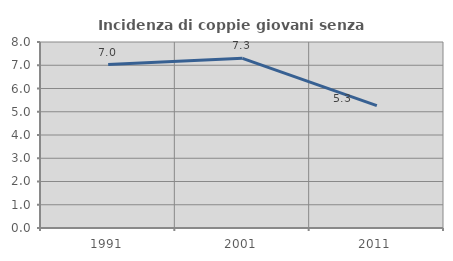
| Category | Incidenza di coppie giovani senza figli |
|---|---|
| 1991.0 | 7.031 |
| 2001.0 | 7.297 |
| 2011.0 | 5.267 |